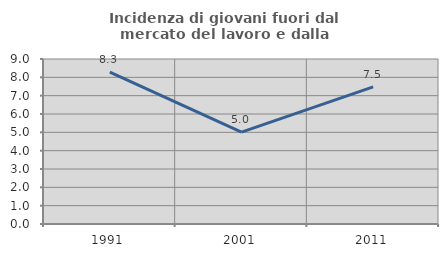
| Category | Incidenza di giovani fuori dal mercato del lavoro e dalla formazione  |
|---|---|
| 1991.0 | 8.29 |
| 2001.0 | 5.014 |
| 2011.0 | 7.477 |